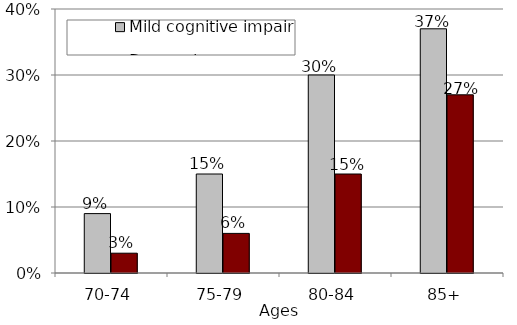
| Category | Mild cognitive impairment | Dementia |
|---|---|---|
| 70-74 | 0.09 | 0.03 |
| 75-79 | 0.15 | 0.06 |
| 80-84 | 0.3 | 0.15 |
| 85+ | 0.37 | 0.27 |